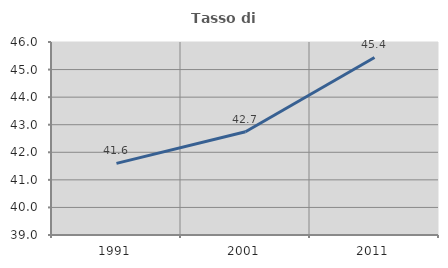
| Category | Tasso di occupazione   |
|---|---|
| 1991.0 | 41.599 |
| 2001.0 | 42.745 |
| 2011.0 | 45.44 |